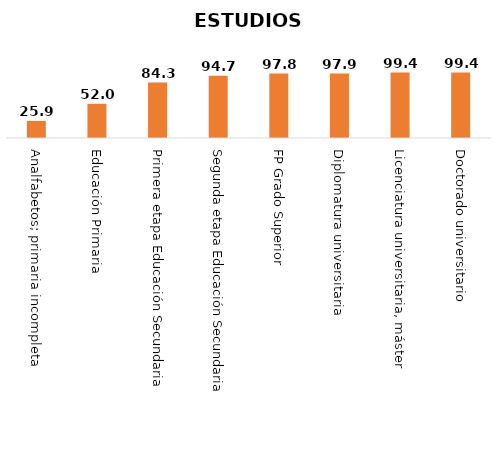
| Category | Series 0 |
|---|---|
| Analfabetos; primaria incompleta | 25.9 |
| Educación Primaria | 52 |
| Primera etapa Educación Secundaria | 84.3 |
| Segunda etapa Educación Secundaria | 94.7 |
| FP Grado Superior | 97.8 |
| Diplomatura universitaria | 97.9 |
| Licenciatura universitaria, máster | 99.4 |
| Doctorado universitario | 99.4 |